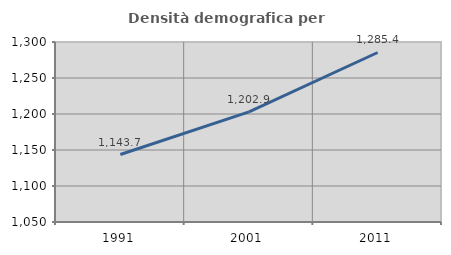
| Category | Densità demografica |
|---|---|
| 1991.0 | 1143.719 |
| 2001.0 | 1202.887 |
| 2011.0 | 1285.427 |